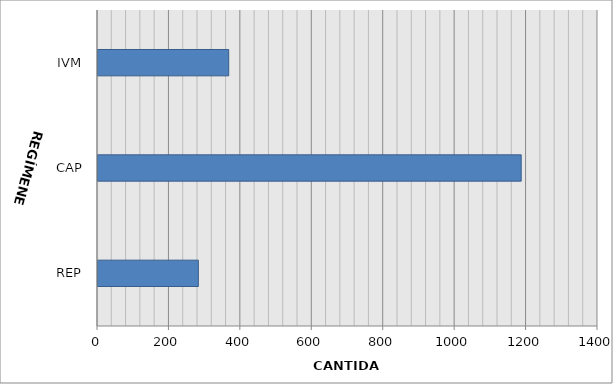
| Category | Series 0 |
|---|---|
| REP | 281 |
| CAP | 1185 |
| IVM | 366 |